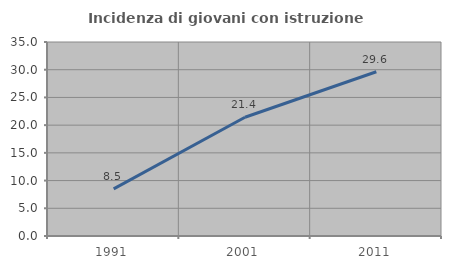
| Category | Incidenza di giovani con istruzione universitaria |
|---|---|
| 1991.0 | 8.511 |
| 2001.0 | 21.429 |
| 2011.0 | 29.63 |